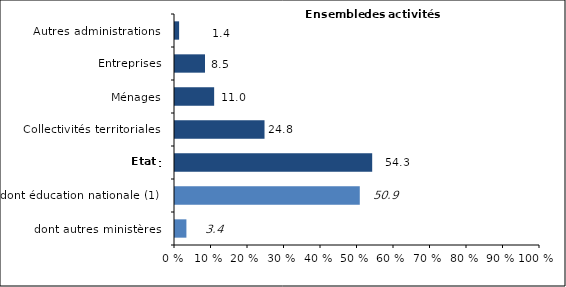
| Category | Series 0 |
|---|---|
| dont autres ministères | 3.4 |
| dont éducation nationale (1) | 50.9 |
| État | 54.3 |
| Collectivités territoriales | 24.8 |
| Ménages | 11 |
|  Entreprises | 8.5 |
| Autres administrations | 1.4 |